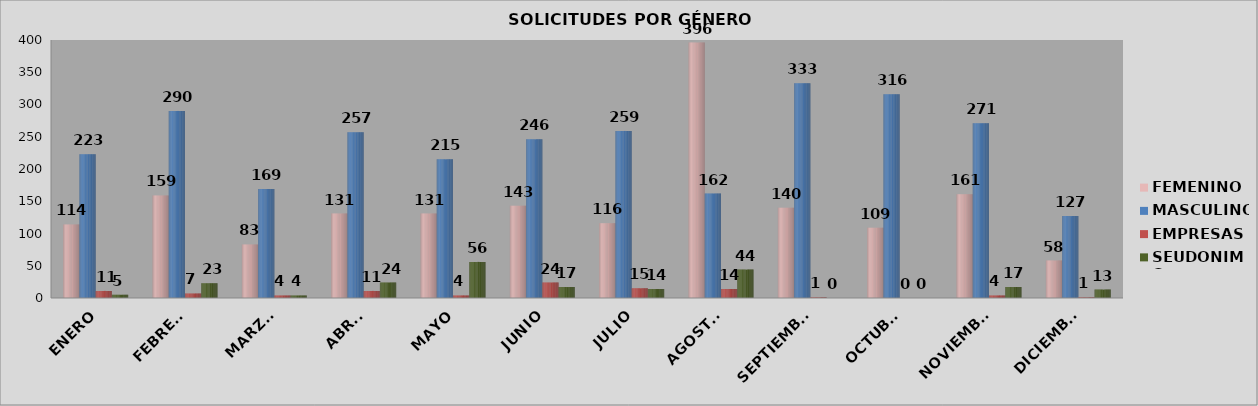
| Category | FEMENINO | MASCULINO | EMPRESAS | SEUDONIMO |
|---|---|---|---|---|
| ENERO | 114 | 223 | 11 | 5 |
| FEBRERO | 159 | 290 | 7 | 23 |
| MARZO  | 83 | 169 | 4 | 4 |
| ABRIL | 131 | 257 | 11 | 24 |
| MAYO | 131 | 215 | 4 | 56 |
| JUNIO | 143 | 246 | 24 | 17 |
| JULIO | 116 | 259 | 15 | 14 |
| AGOSTO | 396 | 162 | 14 | 44 |
| SEPTIEMBRE | 140 | 333 | 1 | 0 |
| OCTUBRE | 109 | 316 | 0 | 0 |
| NOVIEMBRE | 161 | 271 | 4 | 17 |
| DICIEMBRE | 58 | 127 | 1 | 13 |